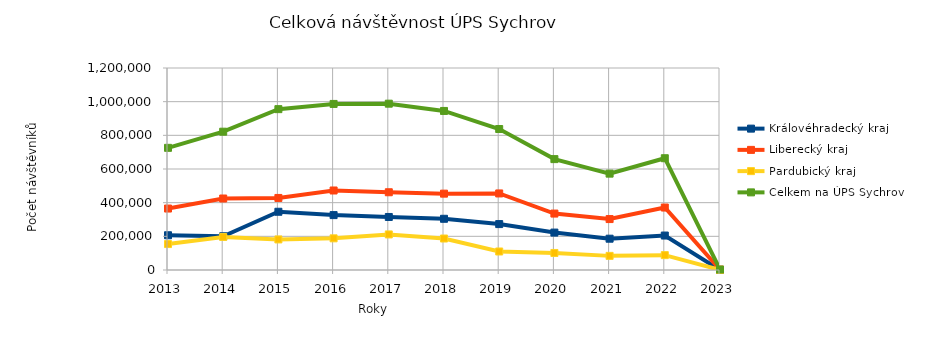
| Category | Královéhradecký kraj | Liberecký kraj | Pardubický kraj | Celkem na ÚPS Sychrov |
|---|---|---|---|---|
| 2013.0 | 206419 | 365108 | 154165 | 725692 |
| 2014.0 | 200438 | 424718 | 196473 | 821629 |
| 2015.0 | 345970 | 428023 | 181567 | 955560 |
| 2016.0 | 326137 | 472318 | 188108 | 986563 |
| 2017.0 | 314983 | 461803 | 211268 | 988054 |
| 2018.0 | 304267 | 453568 | 187017 | 944852 |
| 2019.0 | 272720 | 454785 | 109949 | 837454 |
| 2020.0 | 222238 | 335261 | 101211 | 658710 |
| 2021.0 | 185934 | 302574 | 83925 | 572433 |
| 2022.0 | 204678 | 371041 | 88282 | 664001 |
| 2023.0 | 38 | 2252 | 591 | 2881 |